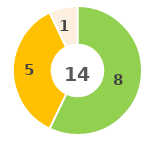
| Category | Series 0 |
|---|---|
| 0 | 0 |
| 1 | 8 |
| 2 | 5 |
| 3 | 0 |
| 4 | 1 |